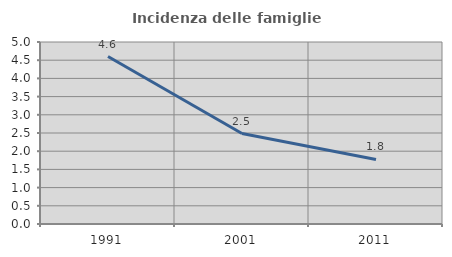
| Category | Incidenza delle famiglie numerose |
|---|---|
| 1991.0 | 4.601 |
| 2001.0 | 2.484 |
| 2011.0 | 1.772 |